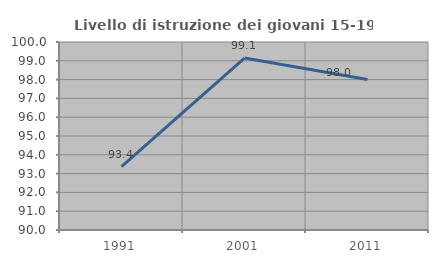
| Category | Livello di istruzione dei giovani 15-19 anni |
|---|---|
| 1991.0 | 93.373 |
| 2001.0 | 99.145 |
| 2011.0 | 98 |